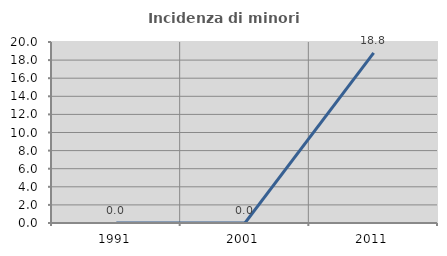
| Category | Incidenza di minori stranieri |
|---|---|
| 1991.0 | 0 |
| 2001.0 | 0 |
| 2011.0 | 18.788 |